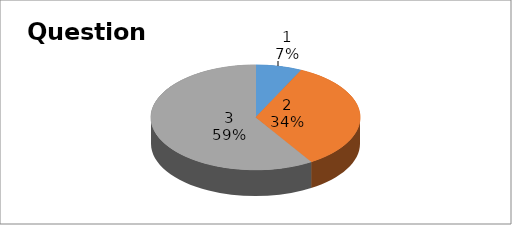
| Category | Series 0 |
|---|---|
| 0 | 4 |
| 1 | 19 |
| 2 | 33 |